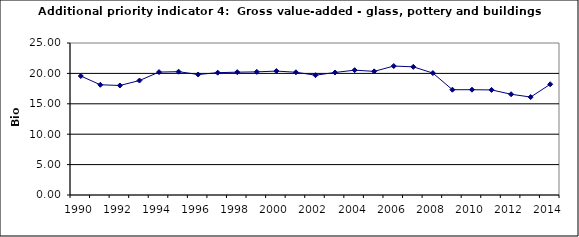
| Category | Gross value-added - glass, pottery and buildings materials industry, Bio Euro (EC95) |
|---|---|
| 1990 | 19.571 |
| 1991 | 18.129 |
| 1992 | 18.013 |
| 1993 | 18.825 |
| 1994 | 20.217 |
| 1995 | 20.284 |
| 1996 | 19.82 |
| 1997 | 20.118 |
| 1998 | 20.201 |
| 1999 | 20.25 |
| 2000 | 20.383 |
| 2001 | 20.184 |
| 2002 | 19.704 |
| 2003 | 20.151 |
| 2004 | 20.532 |
| 2005 | 20.333 |
| 2006 | 21.212 |
| 2007 | 21.079 |
| 2008 | 20.052 |
| 2009 | 17.317 |
| 2010 | 17.317 |
| 2011 | 17.284 |
| 2012 | 16.572 |
| 2013 | 16.108 |
| 2014 | 18.212 |